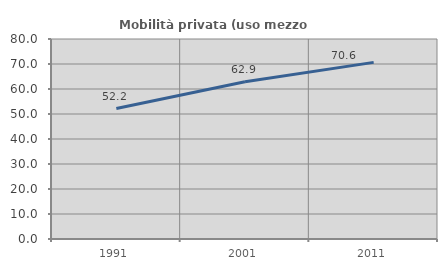
| Category | Mobilità privata (uso mezzo privato) |
|---|---|
| 1991.0 | 52.171 |
| 2001.0 | 62.925 |
| 2011.0 | 70.65 |